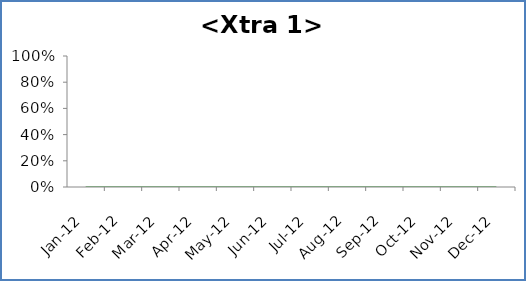
| Category | <Xtra 1> | Median | Goal |
|---|---|---|---|
| 2012-01-01 |  | 0 | 0 |
| 2012-02-01 |  | 0 | 0 |
| 2012-03-01 |  | 0 | 0 |
| 2012-04-01 |  | 0 | 0 |
| 2012-05-01 |  | 0 | 0 |
| 2012-06-01 |  | 0 | 0 |
| 2012-07-01 |  | 0 | 0 |
| 2012-08-01 |  | 0 | 0 |
| 2012-09-01 |  | 0 | 0 |
| 2012-10-01 |  | 0 | 0 |
| 2012-11-01 |  | 0 | 0 |
| 2012-12-01 |  | 0 | 0 |